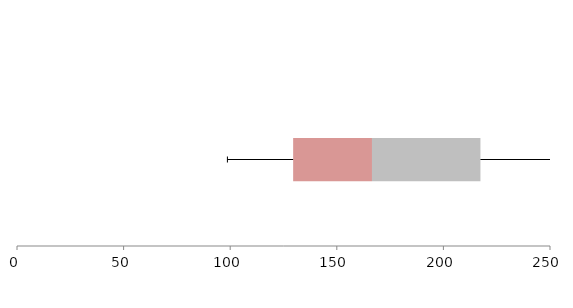
| Category | Series 1 | Series 2 | Series 3 |
|---|---|---|---|
| 0 | 129.526 | 36.975 | 50.87 |